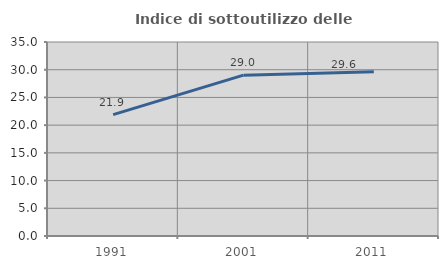
| Category | Indice di sottoutilizzo delle abitazioni  |
|---|---|
| 1991.0 | 21.903 |
| 2001.0 | 29.015 |
| 2011.0 | 29.624 |